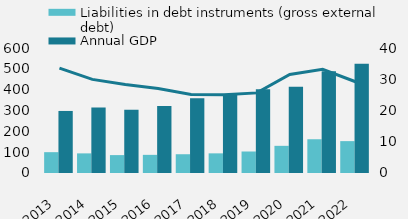
| Category | Liabilities in debt instruments (gross external debt) | Annual GDP |
|---|---|---|
| 2013.0 | 99987.783 | 297844 |
| 2014.0 | 94176.047 | 314378 |
| 2015.0 | 85917.134 | 303641 |
| 2016.0 | 87126.961 | 322071 |
| 2017.0 | 90081.592 | 358340.299 |
| 2018.0 | 94307.213 | 376090.154 |
| 2019.0 | 103200 | 402445.84 |
| 2020.0 | 130408 | 413548.984 |
| 2021.0 | 162003 | 488417 |
| 2022.0 | 152997 | 523922 |